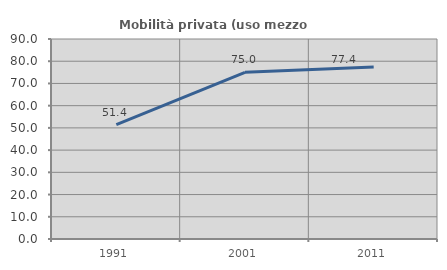
| Category | Mobilità privata (uso mezzo privato) |
|---|---|
| 1991.0 | 51.429 |
| 2001.0 | 75 |
| 2011.0 | 77.419 |